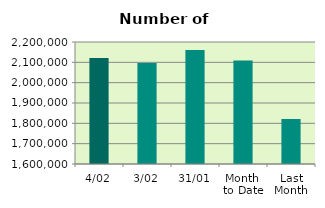
| Category | Series 0 |
|---|---|
| 4/02 | 2120852 |
| 3/02 | 2096520 |
| 31/01 | 2160812 |
| Month 
to Date | 2108686 |
| Last
Month | 1821445.364 |